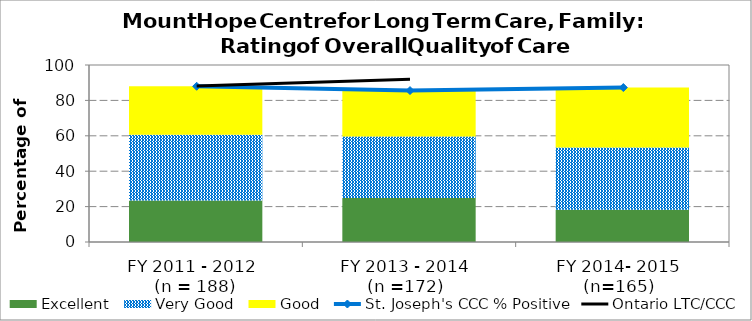
| Category | Excellent | Very Good | Good |
|---|---|---|---|
| FY 2011 - 2012 
(n = 188) | 23.5 | 37.16 | 27.32 |
| FY 2013 - 2014 
(n =172)  | 24.86 | 34.68 | 26.01 |
| FY 2014- 2015 
(n=165)  | 18.18 | 35.14 | 33.94 |